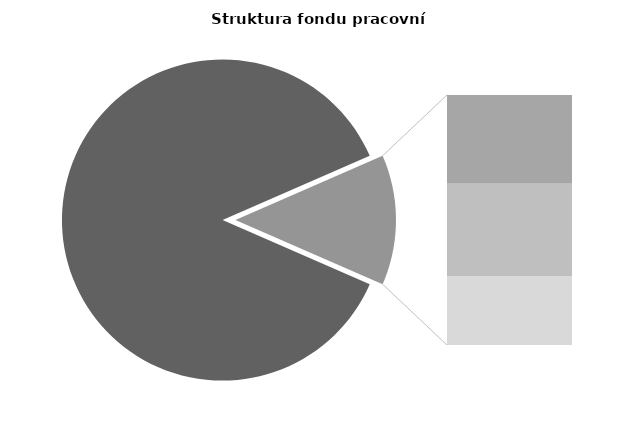
| Category | Series 0 |
|---|---|
| Průměrná měsíční 
odpracovaná doba  
bez přesčasu | 148.223 |
| Dovolená | 7.92 |
| Nemoc | 8.26 |
| Jiné | 6.161 |